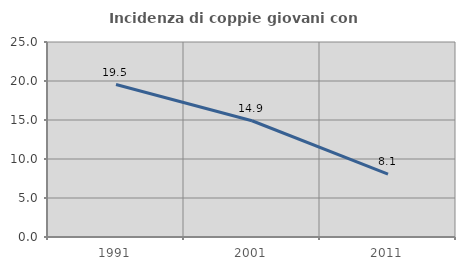
| Category | Incidenza di coppie giovani con figli |
|---|---|
| 1991.0 | 19.543 |
| 2001.0 | 14.902 |
| 2011.0 | 8.052 |